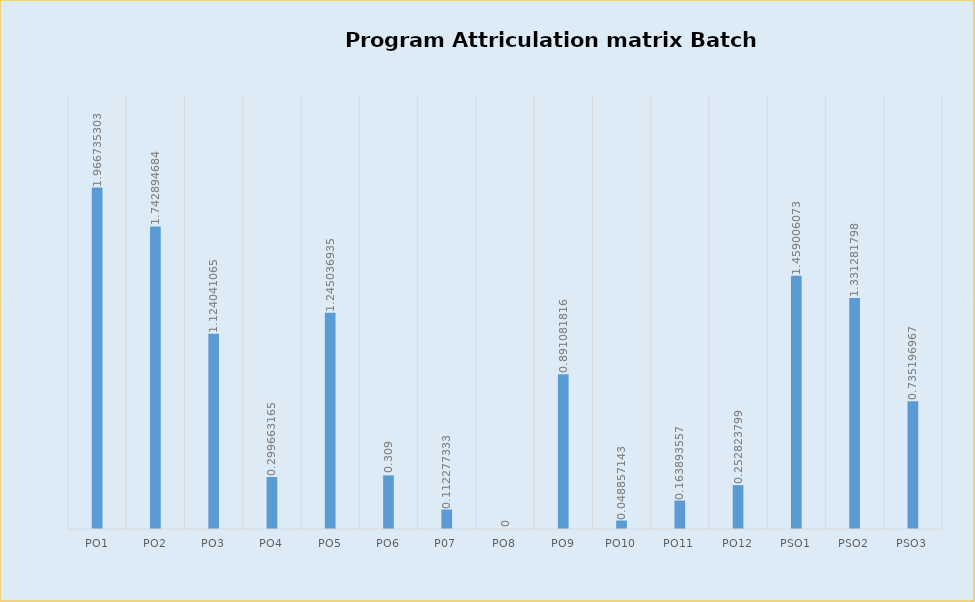
| Category | Series 0 |
|---|---|
| 0 | 1.967 |
| 1 | 1.743 |
| 2 | 1.124 |
| 3 | 0.3 |
| 4 | 1.245 |
| 5 | 0.309 |
| 6 | 0.112 |
| 7 | 0 |
| 8 | 0.891 |
| 9 | 0.049 |
| 10 | 0.164 |
| 11 | 0.253 |
| 12 | 1.459 |
| 13 | 1.331 |
| 14 | 0.735 |